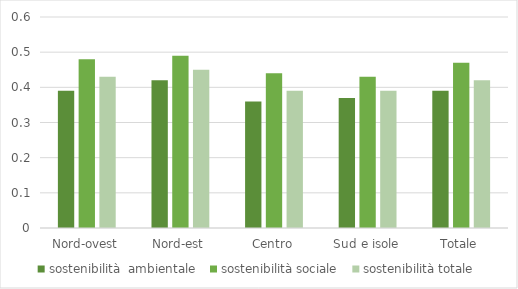
| Category | sostenibilità  ambientale  | sostenibilità sociale  | sostenibilità totale |
|---|---|---|---|
| Nord-ovest | 0.39 | 0.48 | 0.43 |
| Nord-est | 0.42 | 0.49 | 0.45 |
| Centro | 0.36 | 0.44 | 0.39 |
| Sud e isole | 0.37 | 0.43 | 0.39 |
| Totale | 0.39 | 0.47 | 0.42 |